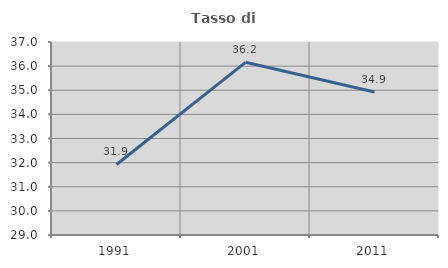
| Category | Tasso di occupazione   |
|---|---|
| 1991.0 | 31.923 |
| 2001.0 | 36.158 |
| 2011.0 | 34.928 |